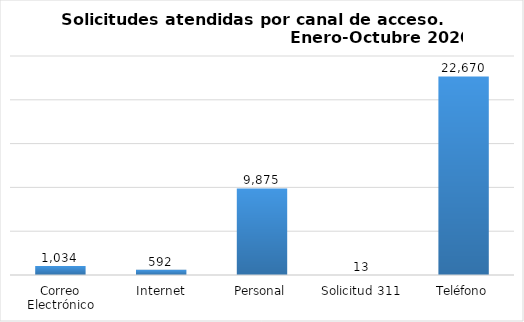
| Category | Total |
|---|---|
| Correo Electrónico | 1034 |
| Internet | 592 |
| Personal | 9875 |
| Solicitud 311 | 13 |
| Teléfono | 22670 |